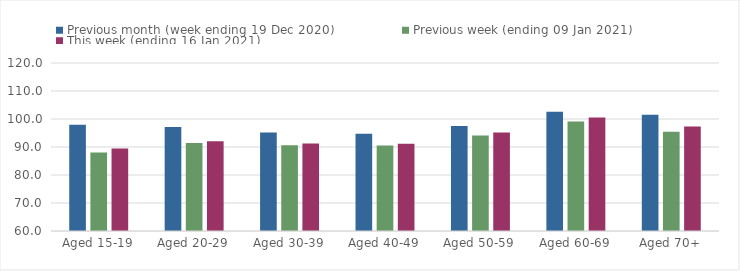
| Category | Previous month (week ending 19 Dec 2020) | Previous week (ending 09 Jan 2021) | This week (ending 16 Jan 2021) |
|---|---|---|---|
| Aged 15-19 | 97.91 | 88.08 | 89.5 |
| Aged 20-29 | 97.16 | 91.41 | 92.05 |
| Aged 30-39 | 95.22 | 90.63 | 91.24 |
| Aged 40-49 | 94.72 | 90.51 | 91.19 |
| Aged 50-59 | 97.48 | 94.13 | 95.22 |
| Aged 60-69 | 102.58 | 99.13 | 100.56 |
| Aged 70+ | 101.53 | 95.45 | 97.31 |